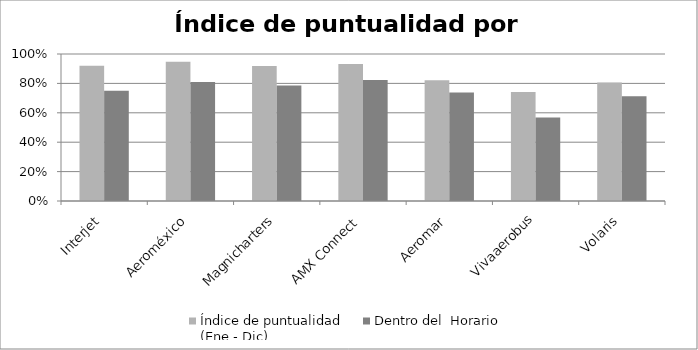
| Category | Índice de puntualidad
(Ene - Dic) | Dentro del  Horario |
|---|---|---|
| Interjet | 0.92 | 0.75 |
| Aeroméxico | 0.947 | 0.81 |
| Magnicharters | 0.919 | 0.785 |
| AMX Connect | 0.932 | 0.823 |
| Aeromar | 0.822 | 0.738 |
| Vivaaerobus | 0.742 | 0.568 |
| Volaris | 0.807 | 0.713 |